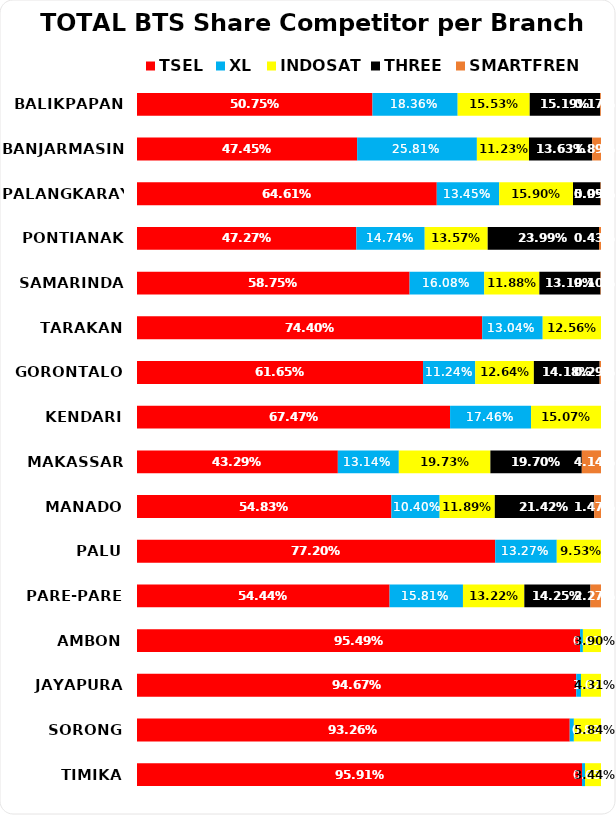
| Category | TSEL | XL | INDOSAT | THREE | SMARTFREN |
|---|---|---|---|---|---|
| BALIKPAPAN | 0.507 | 0.184 | 0.155 | 0.152 | 0.002 |
| BANJARMASIN | 0.474 | 0.258 | 0.112 | 0.136 | 0.019 |
| PALANGKARAYA | 0.646 | 0.135 | 0.159 | 0.059 | 0.001 |
| PONTIANAK | 0.473 | 0.147 | 0.136 | 0.24 | 0.004 |
| SAMARINDA | 0.588 | 0.161 | 0.119 | 0.132 | 0.001 |
| TARAKAN | 0.744 | 0.13 | 0.126 | 0 | 0 |
| GORONTALO | 0.616 | 0.112 | 0.126 | 0.142 | 0.003 |
| KENDARI | 0.675 | 0.175 | 0.151 | 0 | 0 |
| MAKASSAR | 0.433 | 0.131 | 0.197 | 0.197 | 0.041 |
| MANADO | 0.548 | 0.104 | 0.119 | 0.214 | 0.015 |
| PALU | 0.772 | 0.133 | 0.095 | 0 | 0 |
| PARE-PARE | 0.544 | 0.158 | 0.132 | 0.143 | 0.023 |
| AMBON | 0.955 | 0.006 | 0.039 | 0 | 0 |
| JAYAPURA | 0.947 | 0.01 | 0.043 | 0 | 0 |
| SORONG | 0.933 | 0.009 | 0.058 | 0 | 0 |
| TIMIKA | 0.959 | 0.006 | 0.034 | 0 | 0 |